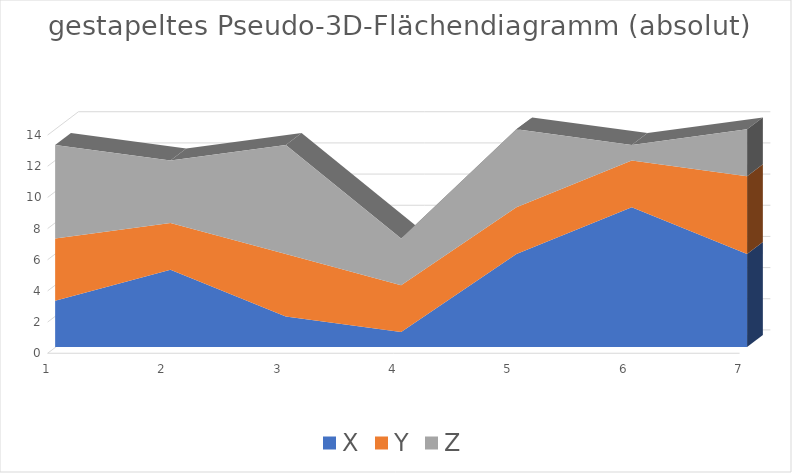
| Category | X | Y | Z |
|---|---|---|---|
| 0 | 3 | 4 | 6 |
| 1 | 5 | 3 | 4 |
| 2 | 2 | 4 | 7 |
| 3 | 1 | 3 | 3 |
| 4 | 6 | 3 | 5 |
| 5 | 9 | 3 | 1 |
| 6 | 6 | 5 | 3 |